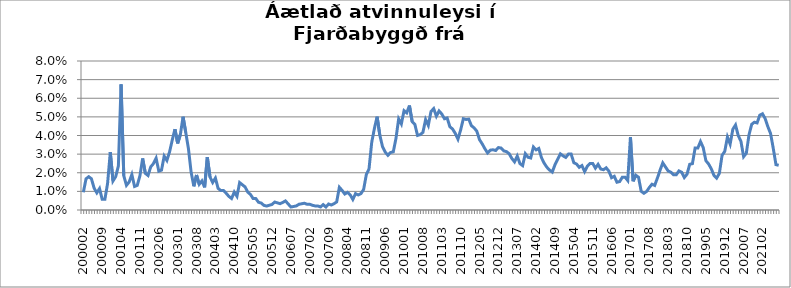
| Category | Series 0 |
|---|---|
| 200002 | 0.009 |
| 200003 | 0.017 |
| 200004 | 0.018 |
| 200005 | 0.017 |
| 200006 | 0.012 |
| 200007 | 0.009 |
| 200008 | 0.012 |
| 200009 | 0.006 |
| 200010 | 0.006 |
| 200011 | 0.014 |
| 200012 | 0.031 |
| 200101 | 0.016 |
| 200102 | 0.018 |
| 200103 | 0.024 |
| 200104 | 0.067 |
| 200105 | 0.018 |
| 200106 | 0.013 |
| 200107 | 0.015 |
| 200108 | 0.019 |
| 200109 | 0.013 |
| 200110 | 0.013 |
| 200111 | 0.018 |
| 200112 | 0.028 |
| 200201 | 0.02 |
| 200202 | 0.019 |
| 200203 | 0.023 |
| 200204 | 0.025 |
| 200205 | 0.028 |
| 200206 | 0.021 |
| 200207 | 0.021 |
| 200208 | 0.029 |
| 200209 | 0.027 |
| 200210 | 0.031 |
| 200211 | 0.038 |
| 200212 | 0.043 |
| 200301 | 0.036 |
| 200302 | 0.041 |
| 200303 | 0.05 |
| 200304 | 0.042 |
| 200305 | 0.033 |
| 200306 | 0.02 |
| 200307 | 0.013 |
| 200308 | 0.019 |
| 200309 | 0.014 |
| 200310 | 0.016 |
| 200311 | 0.012 |
| 200312 | 0.028 |
| 200401 | 0.018 |
| 200402 | 0.015 |
| 200403 | 0.017 |
| 200404 | 0.012 |
| 200405 | 0.01 |
| 200406 | 0.01 |
| 200407 | 0.009 |
| 200408 | 0.007 |
| 200409 | 0.006 |
| 200410 | 0.01 |
| 200411 | 0.007 |
| 200412 | 0.015 |
| 200501 | 0.014 |
| 200502 | 0.012 |
| 200503 | 0.01 |
| 200504 | 0.008 |
| 200505 | 0.006 |
| 200506 | 0.006 |
| 200507 | 0.004 |
| 200508 | 0.004 |
| 200509 | 0.002 |
| 200510 | 0.002 |
| 200511 | 0.003 |
| 200512 | 0.003 |
| 200601 | 0.004 |
| 200602 | 0.004 |
| 200603 | 0.003 |
| 200604 | 0.004 |
| 200605 | 0.005 |
| 200606 | 0.003 |
| 200607 | 0.002 |
| 200608 | 0.002 |
| 200609 | 0.002 |
| 200610 | 0.003 |
| 200611 | 0.003 |
| 200612 | 0.004 |
| 200701 | 0.003 |
| 200702 | 0.003 |
| 200703 | 0.003 |
| 200704 | 0.002 |
| 200705 | 0.002 |
| 200706 | 0.002 |
| 200707 | 0.003 |
| 200708 | 0.002 |
| 200709 | 0.003 |
| 200710 | 0.003 |
| 200711 | 0.003 |
| 200712 | 0.004 |
| 200801 | 0.012 |
| 200802 | 0.011 |
| 200803 | 0.009 |
| 200804 | 0.009 |
| 200805 | 0.008 |
| 200806 | 0.006 |
| 200807 | 0.009 |
| 200808 | 0.008 |
| 200809 | 0.009 |
| 200810 | 0.011 |
| 200811 | 0.019 |
| 200812 | 0.022 |
| 200901 | 0.036 |
| 200902 | 0.044 |
| 200903 | 0.05 |
| 200904 | 0.04 |
| 200905 | 0.034 |
| 200906 | 0.031 |
| 200907 | 0.029 |
| 200908 | 0.031 |
| 200909 | 0.031 |
| 200910 | 0.038 |
| 200911 | 0.049 |
| 200912 | 0.046 |
| 201001 | 0.053 |
| 201002 | 0.052 |
| 201003 | 0.056 |
| 201004 | 0.048 |
| 201005 | 0.046 |
| 201006 | 0.04 |
| 201007 | 0.04 |
| 201008 | 0.042 |
| 201009 | 0.049 |
| 201010 | 0.045 |
| 201011 | 0.053 |
| 201012 | 0.054 |
| 201101 | 0.05 |
| 201102 | 0.053 |
| 201103 | 0.052 |
| 201104 | 0.049 |
| 201105 | 0.049 |
| 201106 | 0.045 |
| 201107 | 0.043 |
| 201108 | 0.041 |
| 201109 | 0.038 |
| 201110 | 0.043 |
| 201111 | 0.049 |
| 201112 | 0.049 |
| 201201 | 0.049 |
| 201202 | 0.045 |
| 201203 | 0.044 |
| 201204 | 0.042 |
| 201205 | 0.038 |
| 201206 | 0.036 |
| 201207 | 0.033 |
| 201208 | 0.031 |
| 201209 | 0.032 |
| 201210 | 0.032 |
| 201211 | 0.032 |
| 201212 | 0.034 |
| 201301 | 0.033 |
| 201302 | 0.032 |
| 201303 | 0.031 |
| 201304 | 0.03 |
| 201305 | 0.028 |
| 201306 | 0.026 |
| 201307 | 0.029 |
| 201308 | 0.025 |
| 201309 | 0.024 |
| 201310 | 0.03 |
| 201311 | 0.028 |
| 201312 | 0.028 |
| 201401 | 0.034 |
| 201402 | 0.032 |
| 201403 | 0.033 |
| 201404 | 0.028 |
| 201405 | 0.025 |
| 201406 | 0.023 |
| 201407 | 0.021 |
| 201408 | 0.02 |
| 201409 | 0.024 |
| 201410 | 0.027 |
| 201411 | 0.03 |
| 201412 | 0.029 |
| 201501 | 0.028 |
| 201502 | 0.03 |
| 201503 | 0.03 |
| 201504 | 0.025 |
| 201505 | 0.025 |
| 201506 | 0.023 |
| 201507 | 0.024 |
| 201508 | 0.021 |
| 201509 | 0.023 |
| 201510 | 0.025 |
| 201511 | 0.025 |
| 201512 | 0.022 |
| 201601 | 0.025 |
| 201602 | 0.022 |
| 201603 | 0.022 |
| 201604 | 0.023 |
| 201605 | 0.021 |
| 201606 | 0.017 |
| 201607 | 0.018 |
| 201608 | 0.015 |
| 201609 | 0.015 |
| 201610 | 0.018 |
| 201611 | 0.018 |
| 201612 | 0.016 |
| 201701 | 0.039 |
| 201702 | 0.015 |
| 201703 | 0.019 |
| 201704 | 0.018 |
| 201705 | 0.01 |
| 201706 | 0.009 |
| 201707 | 0.01 |
| 201708 | 0.012 |
| 201709 | 0.014 |
| 201710 | 0.013 |
| 201711 | 0.017 |
| 201712 | 0.021 |
| 201801 | 0.025 |
| 201802 | 0.023 |
| 201803 | 0.021 |
| 201804 | 0.02 |
| 201805 | 0.019 |
| 201806 | 0.019 |
| 201807 | 0.021 |
| 201808 | 0.02 |
| 201809 | 0.017 |
| 201810 | 0.019 |
| 201811 | 0.025 |
| 201812 | 0.025 |
| 201901 | 0.033 |
| 201902 | 0.033 |
| 201903 | 0.037 |
| 201904 | 0.034 |
| 201905 | 0.026 |
| 201906 | 0.025 |
| 201907 | 0.022 |
| 201908 | 0.019 |
| 201909 | 0.017 |
| 201910 | 0.02 |
| 201911 | 0.029 |
| 201912 | 0.031 |
| 202001 | 0.039 |
| 202002 | 0.035 |
| 202003*** | 0.043 |
| 202004 | 0.046 |
| 202005 | 0.04 |
| 202006 | 0.037 |
| 202007 | 0.029 |
| 202008 | 0.03 |
| 202009 | 0.04 |
| 202010 | 0.046 |
| 202011 | 0.047 |
| 202012 | 0.047 |
| 202101 | 0.051 |
| 202102 | 0.052 |
| 202103 | 0.049 |
| 202104 | 0.045 |
| 202105 | 0.041 |
| 202106 | 0.033 |
| 202107 | 0.024 |
| 202108 | 0.024 |